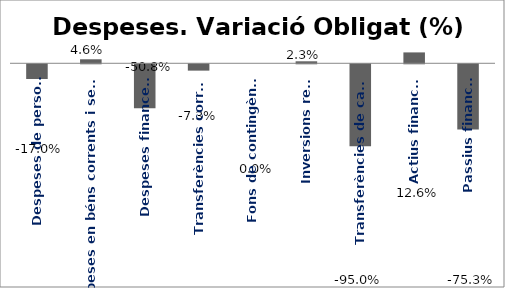
| Category | Series 0 |
|---|---|
| Despeses de personal | -0.17 |
| Despeses en béns corrents i serveis | 0.046 |
| Despeses financeres | -0.508 |
| Transferències corrents | -0.073 |
| Fons de contingència | 0 |
| Inversions reals | 0.023 |
| Transferències de capital | -0.95 |
| Actius financers | 0.126 |
| Passius financers | -0.753 |